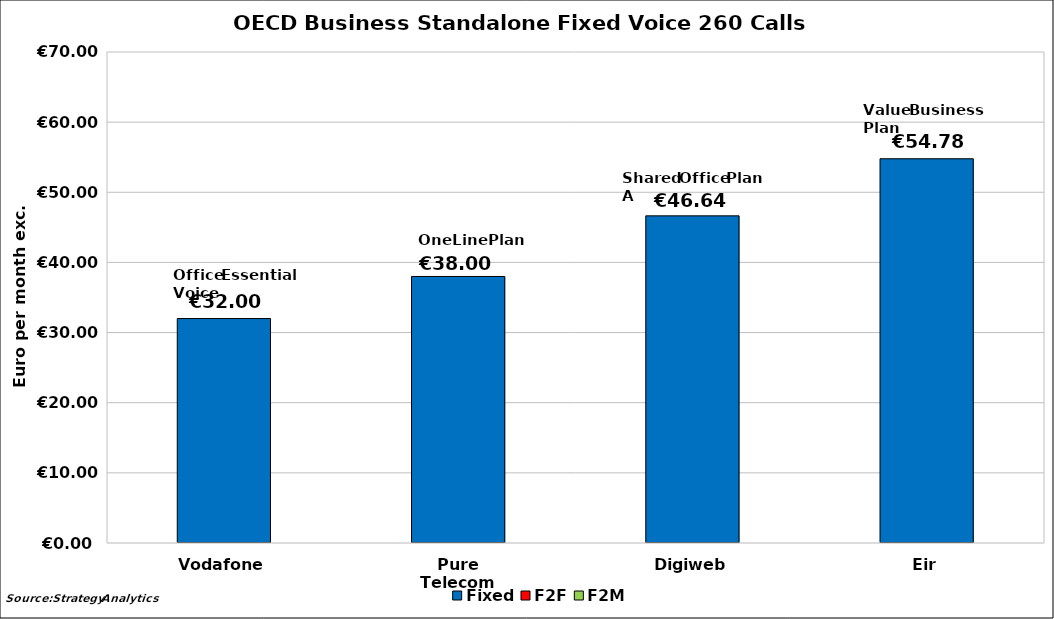
| Category | Fixed | F2F | F2M | Intn |
|---|---|---|---|---|
| Vodafone | 32 | 0 | 0 | 0 |
| Pure Telecom | 38 | 0 | 0 | 0 |
| Digiweb | 46.64 | 0 | 0 | 0 |
| Eir | 54.78 | 0 | 0 | 0 |